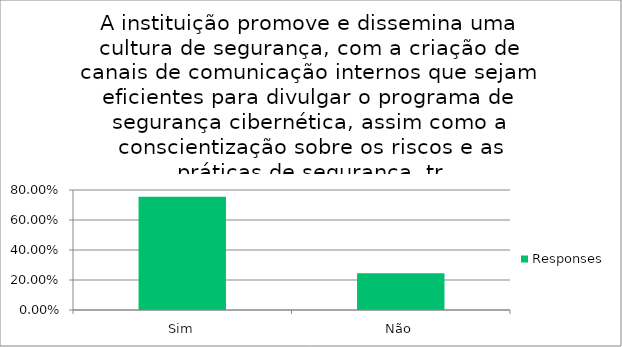
| Category | Responses |
|---|---|
| Sim | 0.755 |
| Não | 0.245 |